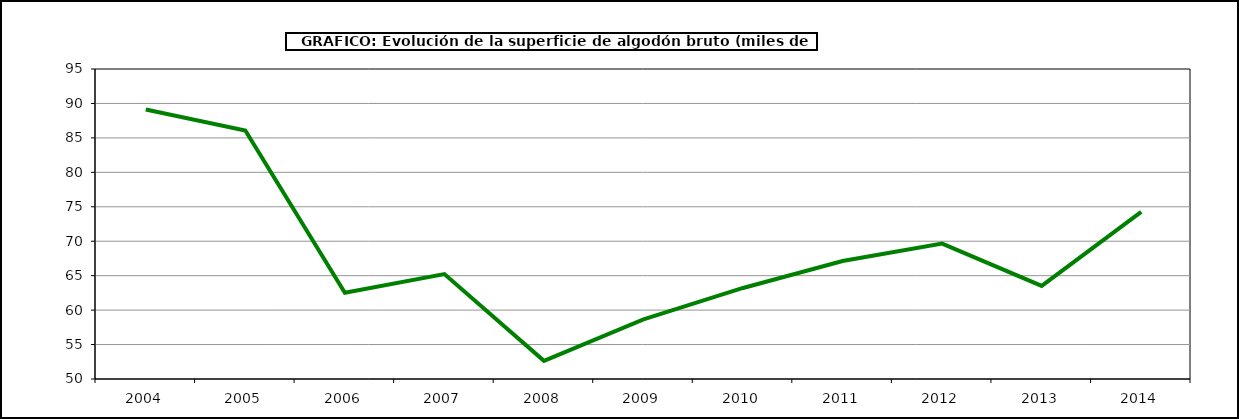
| Category | Superficie |
|---|---|
| 2004.0 | 89.124 |
| 2005.0 | 86.072 |
| 2006.0 | 62.529 |
| 2007.0 | 65.238 |
| 2008.0 | 52.639 |
| 2009.0 | 58.649 |
| 2010.0 | 63.217 |
| 2011.0 | 67.118 |
| 2012.0 | 69.662 |
| 2013.0 | 63.52 |
| 2014.0 | 74.265 |